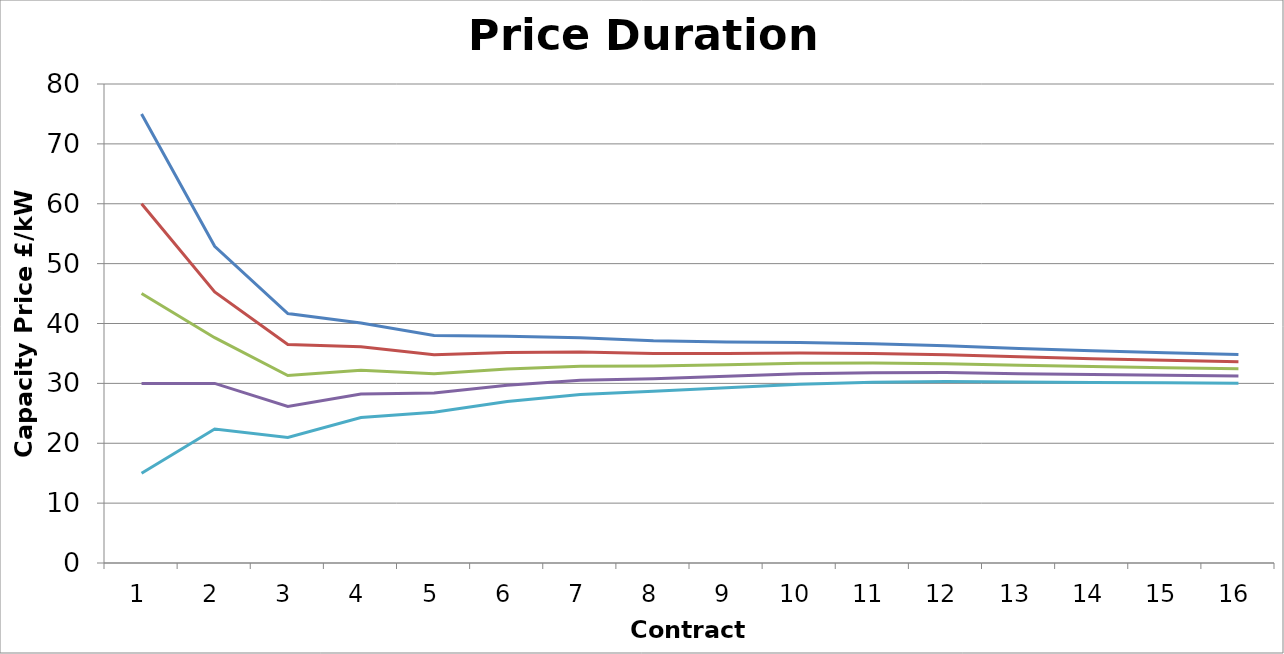
| Category | Series 0 | Series 1 | Series 2 | Series 3 | Series 4 |
|---|---|---|---|---|---|
| 1.0 | 75 | 60 | 45 | 30 | 15 |
| 2.0 | 52.887 | 45.258 | 37.629 | 30 | 22.371 |
| 3.0 | 41.656 | 36.483 | 31.31 | 26.137 | 20.964 |
| 4.0 | 40.077 | 36.131 | 32.185 | 28.24 | 24.294 |
| 5.0 | 38.011 | 34.801 | 31.591 | 28.381 | 25.172 |
| 6.0 | 37.857 | 35.137 | 32.417 | 29.697 | 26.977 |
| 7.0 | 37.618 | 35.248 | 32.878 | 30.507 | 28.137 |
| 8.0 | 37.108 | 34.999 | 32.891 | 30.783 | 28.674 |
| 9.0 | 36.905 | 35 | 33.095 | 31.189 | 29.284 |
| 10.0 | 36.827 | 35.085 | 33.342 | 31.6 | 29.857 |
| 11.0 | 36.612 | 35.002 | 33.392 | 31.782 | 30.172 |
| 12.0 | 36.296 | 34.797 | 33.297 | 31.797 | 30.297 |
| 13.0 | 35.844 | 34.437 | 33.03 | 31.624 | 30.217 |
| 14.0 | 35.456 | 34.129 | 32.802 | 31.475 | 30.148 |
| 15.0 | 35.122 | 33.864 | 32.605 | 31.347 | 30.089 |
| 16.0 | 34.83 | 33.632 | 32.433 | 31.235 | 30.037 |